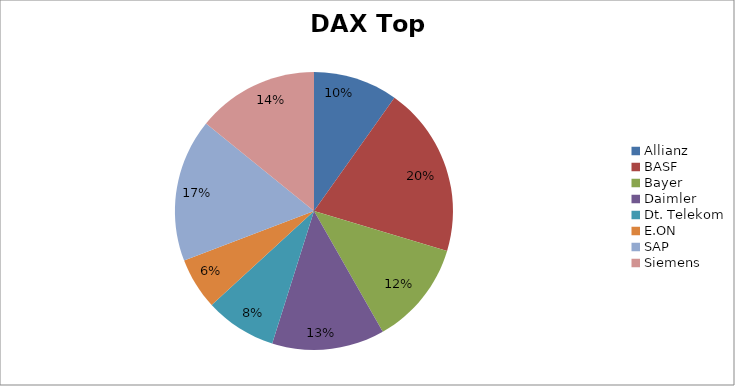
| Category | Series 0 |
|---|---|
| Allianz | 12416.88 |
| BASF | 25058.85 |
| Bayer | 15314 |
| Daimler | 16552.96 |
| Dt. Telekom | 10505.02 |
| E.ON | 7618.19 |
| SAP | 21037.75 |
| Siemens | 17893.48 |